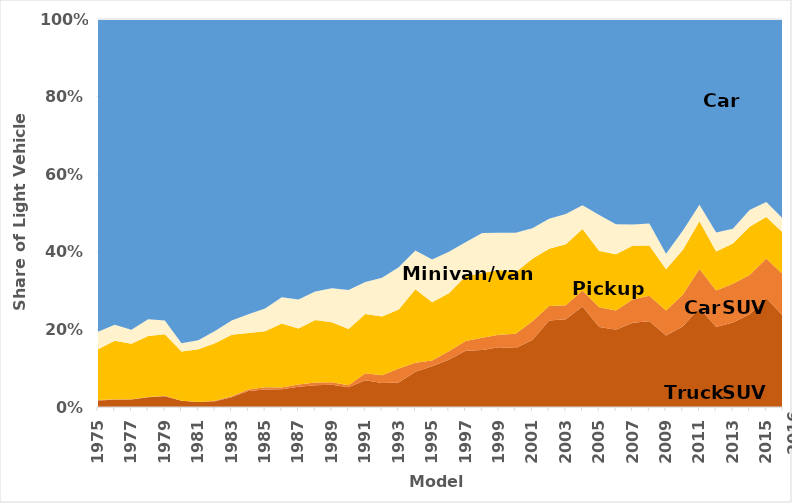
| Category | Truck SUV | Car SUV | Pickup | Minivan/
Van | Car  |
|---|---|---|---|---|---|
| 1975.0 | 0.017 | 0.001 | 0.131 | 0.045 | 0.806 |
| 1976.0 | 0.019 | 0.001 | 0.151 | 0.041 | 0.788 |
| 1977.0 | 0.019 | 0.001 | 0.143 | 0.036 | 0.8 |
| 1978.0 | 0.025 | 0.001 | 0.157 | 0.043 | 0.773 |
| 1979.0 | 0.028 | 0.001 | 0.159 | 0.035 | 0.778 |
| 1980.0 | 0.016 | 0 | 0.127 | 0.021 | 0.835 |
| 1981.0 | 0.013 | 0 | 0.136 | 0.023 | 0.827 |
| 1982.0 | 0.015 | 0.001 | 0.148 | 0.032 | 0.803 |
| 1983.0 | 0.025 | 0.003 | 0.158 | 0.037 | 0.777 |
| 1984.0 | 0.041 | 0.004 | 0.146 | 0.048 | 0.761 |
| 1985.0 | 0.045 | 0.006 | 0.144 | 0.059 | 0.746 |
| 1986.0 | 0.046 | 0.004 | 0.165 | 0.068 | 0.717 |
| 1987.0 | 0.052 | 0.006 | 0.144 | 0.075 | 0.722 |
| 1988.0 | 0.056 | 0.007 | 0.161 | 0.074 | 0.702 |
| 1989.0 | 0.057 | 0.007 | 0.154 | 0.088 | 0.693 |
| 1990.0 | 0.051 | 0.005 | 0.145 | 0.1 | 0.698 |
| 1991.0 | 0.069 | 0.018 | 0.153 | 0.082 | 0.678 |
| 1992.0 | 0.062 | 0.02 | 0.151 | 0.1 | 0.666 |
| 1993.0 | 0.063 | 0.036 | 0.152 | 0.109 | 0.64 |
| 1994.0 | 0.091 | 0.023 | 0.189 | 0.1 | 0.596 |
| 1995.0 | 0.105 | 0.015 | 0.15 | 0.11 | 0.62 |
| 1996.0 | 0.122 | 0.022 | 0.149 | 0.107 | 0.6 |
| 1997.0 | 0.145 | 0.025 | 0.167 | 0.088 | 0.576 |
| 1998.0 | 0.147 | 0.031 | 0.167 | 0.103 | 0.551 |
| 1999.0 | 0.154 | 0.032 | 0.167 | 0.096 | 0.551 |
| 2000.0 | 0.152 | 0.037 | 0.158 | 0.102 | 0.551 |
| 2001.0 | 0.173 | 0.048 | 0.161 | 0.079 | 0.539 |
| 2002.0 | 0.223 | 0.037 | 0.148 | 0.077 | 0.515 |
| 2003.0 | 0.226 | 0.036 | 0.157 | 0.078 | 0.502 |
| 2004.0 | 0.259 | 0.041 | 0.159 | 0.061 | 0.48 |
| 2005.0 | 0.206 | 0.051 | 0.145 | 0.093 | 0.505 |
| 2006.0 | 0.199 | 0.05 | 0.145 | 0.077 | 0.529 |
| 2007.0 | 0.217 | 0.06 | 0.138 | 0.055 | 0.529 |
| 2008.0 | 0.221 | 0.066 | 0.129 | 0.057 | 0.527 |
| 2009.0 | 0.184 | 0.065 | 0.106 | 0.04 | 0.605 |
| 2010.0 | 0.207 | 0.082 | 0.115 | 0.05 | 0.545 |
| 2011.0 | 0.255 | 0.1 | 0.123 | 0.043 | 0.478 |
| 2012.0 | 0.206 | 0.094 | 0.101 | 0.049 | 0.55 |
| 2013.0 | 0.218 | 0.1 | 0.104 | 0.038 | 0.541 |
| 2014.0 | 0.239 | 0.101 | 0.124 | 0.043 | 0.492 |
| 2015.0 | 0.281 | 0.102 | 0.107 | 0.039 | 0.472 |
| 2016.0 | 0.234 | 0.107 | 0.108 | 0.036 | 0.514 |